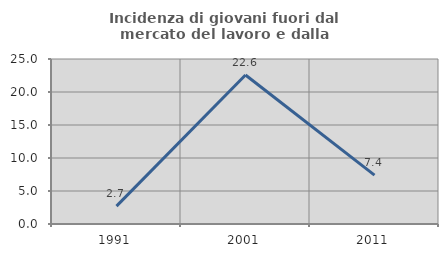
| Category | Incidenza di giovani fuori dal mercato del lavoro e dalla formazione  |
|---|---|
| 1991.0 | 2.703 |
| 2001.0 | 22.581 |
| 2011.0 | 7.407 |